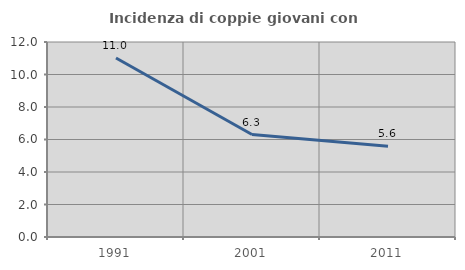
| Category | Incidenza di coppie giovani con figli |
|---|---|
| 1991.0 | 11.017 |
| 2001.0 | 6.304 |
| 2011.0 | 5.588 |